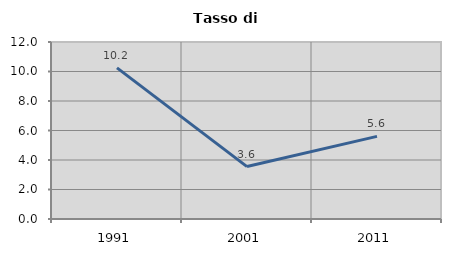
| Category | Tasso di disoccupazione   |
|---|---|
| 1991.0 | 10.245 |
| 2001.0 | 3.555 |
| 2011.0 | 5.603 |